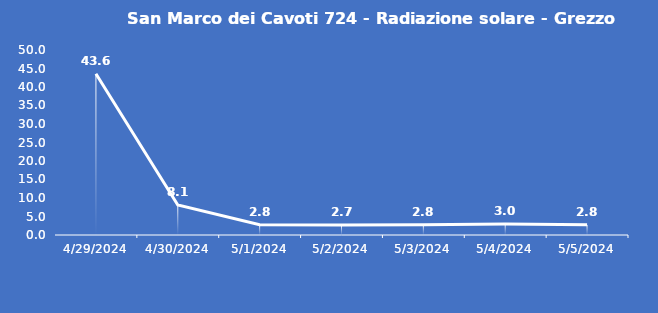
| Category | San Marco dei Cavoti 724 - Radiazione solare - Grezzo (W/m2) |
|---|---|
| 4/29/24 | 43.6 |
| 4/30/24 | 8.1 |
| 5/1/24 | 2.8 |
| 5/2/24 | 2.7 |
| 5/3/24 | 2.8 |
| 5/4/24 | 3 |
| 5/5/24 | 2.8 |